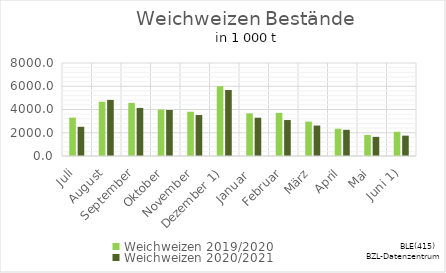
| Category | Weichweizen |
|---|---|
| Juli | 2513.019 |
| August | 4825.702 |
| September | 4136.565 |
| Oktober | 3956.66 |
| November | 3521.867 |
| Dezember 1) | 5679.648 |
| Januar  | 3293.714 |
| Februar | 3093.25 |
| März | 2618.787 |
| April | 2251.674 |
| Mai | 1646.184 |
| Juni 1) | 1751.132 |